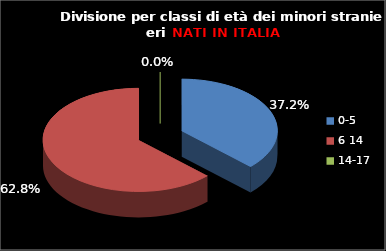
| Category | Series 0 |
|---|---|
| 0-5 | 16 |
| 6 14 | 27 |
| 14-17 | 0 |